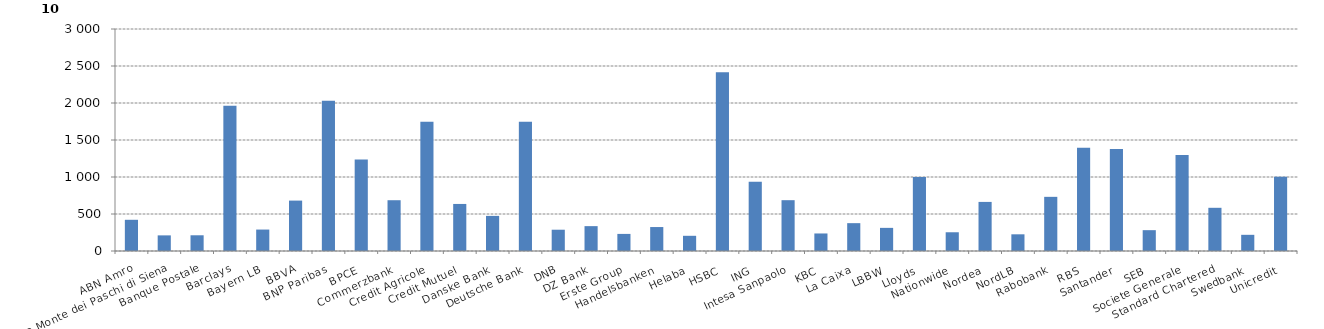
| Category | Total exposures  |
|---|---|
| ABN Amro | 421707.625 |
| Banca Monte dei Paschi di Siena | 211182.778 |
| Banque Postale | 212493.358 |
| Barclays | 1962639.609 |
| Bayern LB | 289756.515 |
| BBVA | 681163.781 |
| BNP Paribas | 2031623.067 |
| BPCE | 1235027 |
| Commerzbank | 686192 |
| Credit Agricole | 1746395 |
| Credit Mutuel | 635772.768 |
| Danske Bank | 474469.654 |
| Deutsche Bank | 1747748.129 |
| DNB | 287606.124 |
| DZ Bank | 335983.802 |
| Erste Group | 230991.549 |
| Handelsbanken | 323792.993 |
| Helaba | 205373.368 |
| HSBC | 2414659.973 |
| ING | 934934.3 |
| Intesa Sanpaolo | 686739.463 |
| KBC | 236939.412 |
| La Caixa | 376236.275 |
| LBBW | 312590.795 |
| Lloyds | 999270.273 |
| Nationwide | 253251.529 |
| Nordea | 663362.3 |
| NordLB | 225518.969 |
| Rabobank | 731867.1 |
| RBS | 1394037.783 |
| Santander | 1379106.715 |
| SEB | 281513.483 |
| Societe Generale | 1296685.151 |
| Standard Chartered | 583762.795 |
| Swedbank | 218642.362 |
| Unicredit | 1004589.78 |